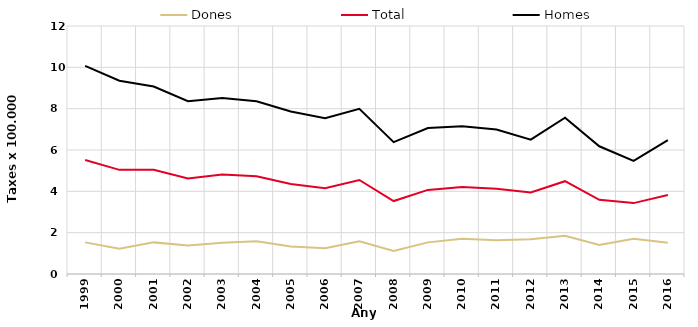
| Category | Dones | Total | Homes |
|---|---|---|---|
| 1999.0 | 1.53 | 5.52 | 10.07 |
| 2000.0 | 1.22 | 5.04 | 9.35 |
| 2001.0 | 1.53 | 5.04 | 9.07 |
| 2002.0 | 1.38 | 4.62 | 8.36 |
| 2003.0 | 1.51 | 4.82 | 8.52 |
| 2004.0 | 1.58 | 4.73 | 8.36 |
| 2005.0 | 1.33 | 4.36 | 7.86 |
| 2006.0 | 1.25 | 4.15 | 7.54 |
| 2007.0 | 1.58 | 4.55 | 7.99 |
| 2008.0 | 1.12 | 3.53 | 6.38 |
| 2009.0 | 1.53 | 4.07 | 7.06 |
| 2010.0 | 1.7 | 4.21 | 7.15 |
| 2011.0 | 1.63 | 4.12 | 6.99 |
| 2012.0 | 1.68 | 3.94 | 6.5 |
| 2013.0 | 1.85 | 4.49 | 7.56 |
| 2014.0 | 1.41 | 3.59 | 6.18 |
| 2015.0 | 1.71 | 3.43 | 5.47 |
| 2016.0 | 1.51 | 3.82 | 6.48 |